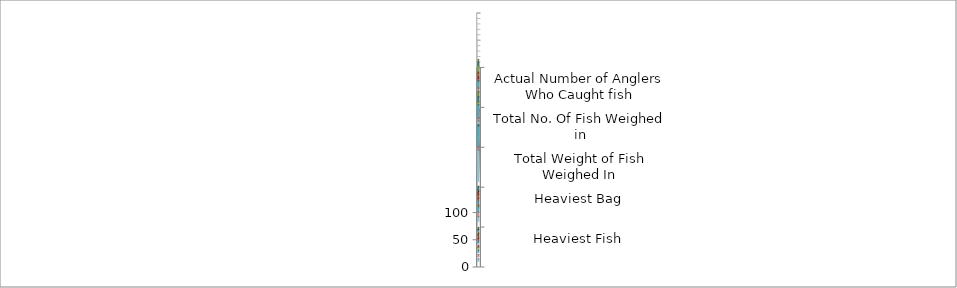
| Category | Series 0 | Series 2 | Series 4 | Series 6 | Series 8 | Series 1 | Series 3 | Series 5 | Series 7 | Series 9 | Series 10 | Series 11 | Series 12 | Series 13 | Series 14 | Series 15 | Series 16 | Series 17 | Series 18 | Series 19 | Series 20 | Series 21 | Series 22 | Series 23 | Series 24 |
|---|---|---|---|---|---|---|---|---|---|---|---|---|---|---|---|---|---|---|---|---|---|---|---|---|---|
| Actual Number of Anglers Who Caught fish |  | 18 | 16 |  | 16 | 6 |  | 10 | 7 |  | 9 |  |  | 18 | 15 |  | 21 |  |  | 16 |  |  | 16 |  |  |
| Total No. Of Fish Weighed in |  | 33 | 26 |  | 23 | 10 |  | 15 | 6 |  | 10 |  |  | 33 | 23 |  | 50 |  |  | 34 |  |  | 37 |  |  |
| Total Weight of Fish Weighed In |  | 45.404 | 46.695 |  | 36.075 | 19.096 |  | 27.869 | 15.692 |  | 17.559 |  |  | 49.644 | 31.272 |  | 85.008 |  |  | 54.186 |  |  | 57.493 |  |  |
| Heaviest Bag |  | 5.203 | 7.239 |  | 5.094 | 7.672 |  | 6.584 | 4.189 |  | 3.167 |  |  | 5.64 | 7.108 |  | 9.996 |  |  | 8.021 |  |  | 8.102 |  |  |
| Heaviest Fish |  | 2.985 | 2.921 |  | 2.504 | 2.504 |  | 2.87 | 2.92 |  | 3.167 |  |  | 3.42 | 3.331 |  | 2.906 |  |  | 3.11 |  |  | 3.578 |  |  |